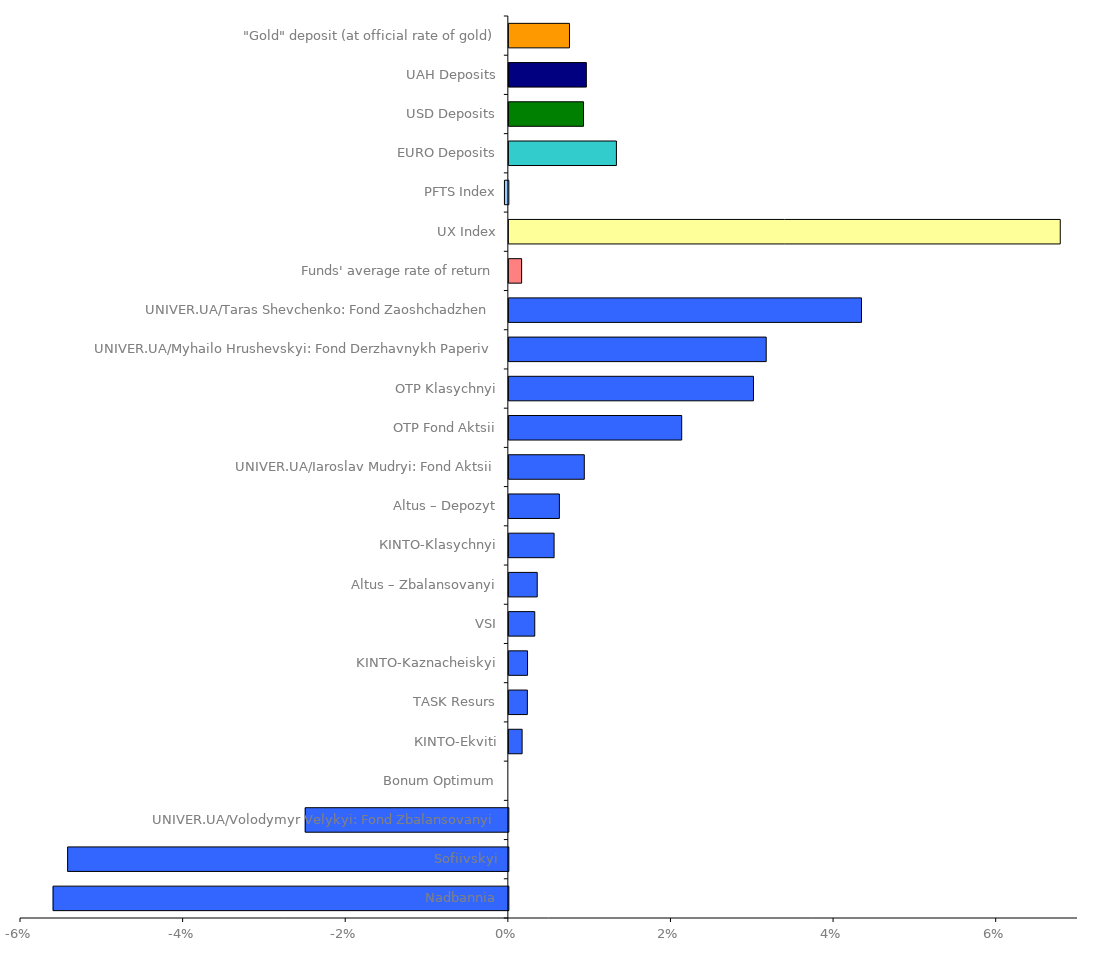
| Category | Series 0 |
|---|---|
| Nadbannia | -0.056 |
| Sofiivskyi | -0.054 |
| UNIVER.UA/Volodymyr Velykyi: Fond Zbalansovanyi | -0.025 |
| Bonum Optimum | 0 |
| КІNTO-Ekviti | 0.002 |
| ТАSK Resurs | 0.002 |
| KINTO-Kaznacheiskyi | 0.002 |
| VSI | 0.003 |
| Altus – Zbalansovanyi | 0.003 |
| КІNТО-Klasychnyi | 0.006 |
| Altus – Depozyt | 0.006 |
| UNIVER.UA/Iaroslav Mudryi: Fond Aktsii | 0.009 |
| OTP Fond Aktsii | 0.021 |
| OTP Klasychnyi | 0.03 |
| UNIVER.UA/Myhailo Hrushevskyi: Fond Derzhavnykh Paperiv | 0.032 |
| UNIVER.UA/Taras Shevchenko: Fond Zaoshchadzhen | 0.043 |
| Funds' average rate of return | 0.002 |
| UX Index | 0.068 |
| PFTS Index | 0 |
| EURO Deposits | 0.013 |
| USD Deposits | 0.009 |
| UAH Deposits | 0.01 |
| "Gold" deposit (at official rate of gold) | 0.007 |